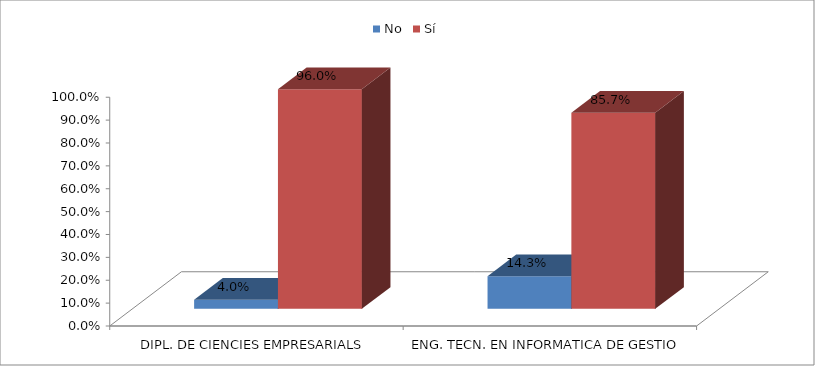
| Category | No | Sí |
|---|---|---|
| DIPL. DE CIENCIES EMPRESARIALS | 0.04 | 0.96 |
| ENG. TECN. EN INFORMATICA DE GESTIO | 0.143 | 0.857 |